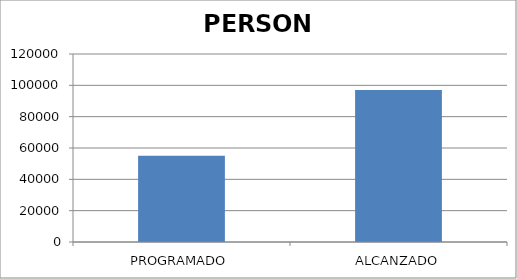
| Category | PERSONA |
|---|---|
| PROGRAMADO | 55000 |
| ALCANZADO | 96950 |